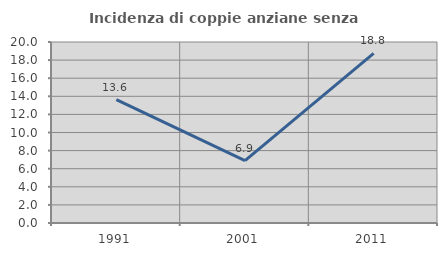
| Category | Incidenza di coppie anziane senza figli  |
|---|---|
| 1991.0 | 13.636 |
| 2001.0 | 6.897 |
| 2011.0 | 18.75 |